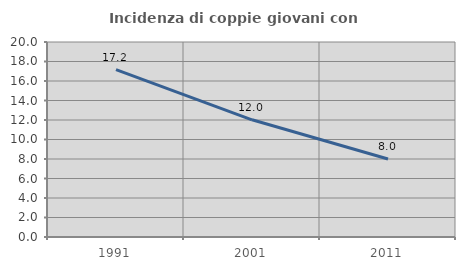
| Category | Incidenza di coppie giovani con figli |
|---|---|
| 1991.0 | 17.16 |
| 2001.0 | 12.019 |
| 2011.0 | 8.006 |